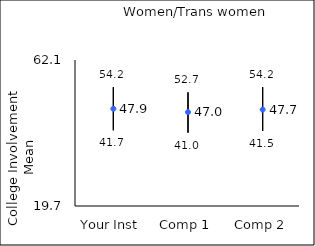
| Category | 25th percentile | 75th percentile | Mean |
|---|---|---|---|
| Your Inst | 41.7 | 54.2 | 47.94 |
| Comp 1 | 41 | 52.7 | 46.97 |
| Comp 2 | 41.5 | 54.2 | 47.7 |